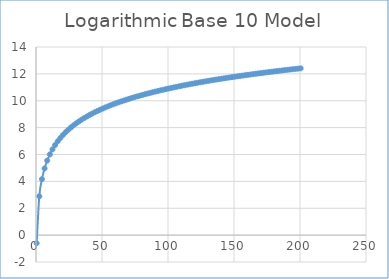
| Category | Series 0 |
|---|---|
| 0.5 | -0.605 |
| 2.5 | 2.89 |
| 4.5 | 4.166 |
| 6.5 | 4.965 |
| 8.5 | 5.547 |
| 10.5 | 6.006 |
| 12.5 | 6.385 |
| 14.5 | 6.707 |
| 16.5 | 6.987 |
| 18.5 | 7.236 |
| 20.5 | 7.459 |
| 22.5 | 7.661 |
| 24.5 | 7.846 |
| 26.5 | 8.016 |
| 28.5 | 8.174 |
| 30.5 | 8.321 |
| 32.5 | 8.459 |
| 34.5 | 8.589 |
| 36.5 | 8.711 |
| 38.5 | 8.827 |
| 40.5 | 8.937 |
| 42.5 | 9.042 |
| 44.5 | 9.142 |
| 46.5 | 9.237 |
| 48.5 | 9.329 |
| 50.5 | 9.416 |
| 52.5 | 9.501 |
| 54.5 | 9.582 |
| 56.5 | 9.66 |
| 58.5 | 9.736 |
| 60.5 | 9.809 |
| 62.5 | 9.879 |
| 64.5 | 9.948 |
| 66.5 | 10.014 |
| 68.5 | 10.078 |
| 70.5 | 10.141 |
| 72.5 | 10.202 |
| 74.5 | 10.261 |
| 76.5 | 10.318 |
| 78.5 | 10.374 |
| 80.5 | 10.429 |
| 82.5 | 10.482 |
| 84.5 | 10.534 |
| 86.5 | 10.585 |
| 88.5 | 10.635 |
| 90.5 | 10.683 |
| 92.5 | 10.731 |
| 94.5 | 10.777 |
| 96.5 | 10.823 |
| 98.5 | 10.867 |
| 100.5 | 10.911 |
| 102.5 | 10.954 |
| 104.5 | 10.996 |
| 106.5 | 11.037 |
| 108.5 | 11.077 |
| 110.5 | 11.117 |
| 112.5 | 11.156 |
| 114.5 | 11.194 |
| 116.5 | 11.232 |
| 118.5 | 11.269 |
| 120.5 | 11.305 |
| 122.5 | 11.341 |
| 124.5 | 11.376 |
| 126.5 | 11.41 |
| 128.5 | 11.445 |
| 130.5 | 11.478 |
| 132.5 | 11.511 |
| 134.5 | 11.544 |
| 136.5 | 11.576 |
| 138.5 | 11.607 |
| 140.5 | 11.638 |
| 142.5 | 11.669 |
| 144.5 | 11.699 |
| 146.5 | 11.729 |
| 148.5 | 11.759 |
| 150.5 | 11.788 |
| 152.5 | 11.816 |
| 154.5 | 11.845 |
| 156.5 | 11.873 |
| 158.5 | 11.9 |
| 160.5 | 11.927 |
| 162.5 | 11.954 |
| 164.5 | 11.981 |
| 166.5 | 12.007 |
| 168.5 | 12.033 |
| 170.5 | 12.059 |
| 172.5 | 12.084 |
| 174.5 | 12.109 |
| 176.5 | 12.134 |
| 178.5 | 12.158 |
| 180.5 | 12.182 |
| 182.5 | 12.206 |
| 184.5 | 12.23 |
| 186.5 | 12.253 |
| 188.5 | 12.277 |
| 190.5 | 12.299 |
| 192.5 | 12.322 |
| 194.5 | 12.345 |
| 196.5 | 12.367 |
| 198.5 | 12.389 |
| 200.5 | 12.411 |